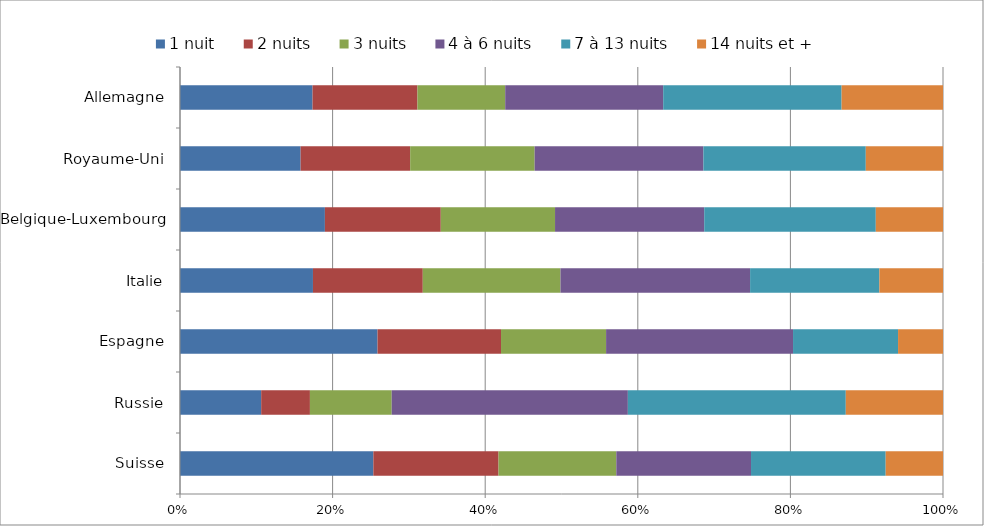
| Category | 1 nuit | 2 nuits | 3 nuits | 4 à 6 nuits | 7 à 13 nuits | 14 nuits et + |
|---|---|---|---|---|---|---|
| Suisse | 25.341 | 16.408 | 15.433 | 17.656 | 17.651 | 7.511 |
| Russie | 10.64 | 6.388 | 10.717 | 30.953 | 28.562 | 12.74 |
| Espagne | 25.89 | 16.182 | 13.772 | 24.502 | 13.765 | 5.89 |
| Italie | 17.426 | 14.395 | 18.044 | 24.852 | 16.942 | 8.34 |
| Belgique-Luxembourg | 18.992 | 15.188 | 14.973 | 19.553 | 22.486 | 8.808 |
| Royaume-Uni | 15.807 | 14.359 | 16.313 | 22.116 | 21.286 | 10.119 |
| Allemagne | 17.371 | 13.751 | 11.501 | 20.707 | 23.382 | 13.289 |